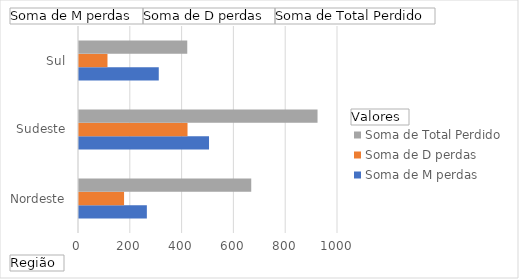
| Category | Soma de M perdas | Soma de D perdas | Soma de Total Perdido |
|---|---|---|---|
| Nordeste | 262 | 174 | 665 |
| Sudeste | 502 | 419 | 921 |
| Sul | 308 | 110 | 418 |